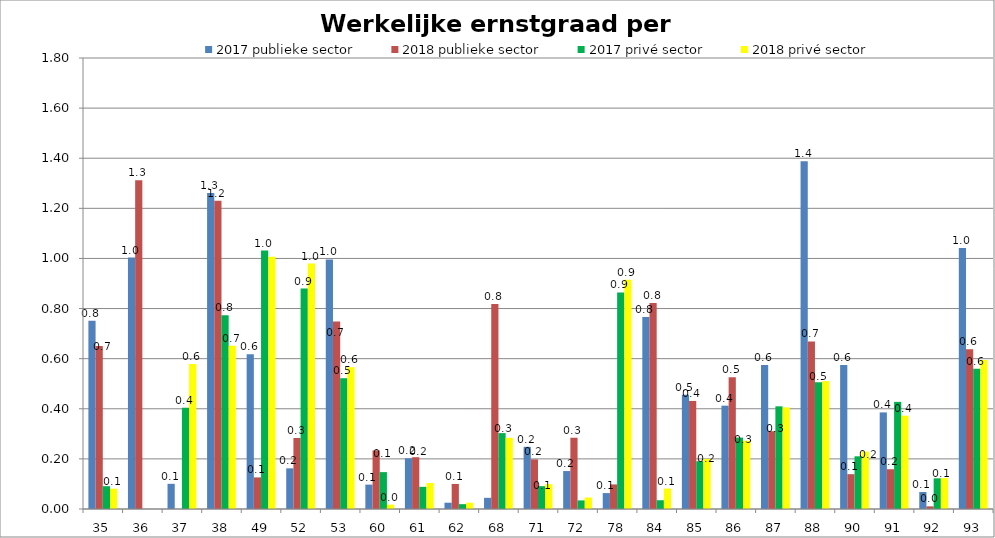
| Category | 2017 publieke sector | 2018 publieke sector | 2017 privé sector | 2018 privé sector |
|---|---|---|---|---|
| 35 | 0.751 | 0.651 | 0.091 | 0.081 |
| 36 | 1.003 | 1.312 | 0 | 0 |
| 37 | 0.1 | 0 | 0.405 | 0.579 |
| 38 | 1.261 | 1.23 | 0.773 | 0.652 |
| 49 | 0.618 | 0.126 | 1.031 | 1.007 |
| 52 | 0.162 | 0.283 | 0.88 | 0.979 |
| 53 | 0.996 | 0.749 | 0.522 | 0.566 |
| 60 | 0.097 | 0.234 | 0.147 | 0.017 |
| 61 | 0.203 | 0.207 | 0.088 | 0.104 |
| 62 | 0.025 | 0.1 | 0.019 | 0.025 |
| 68 | 0.045 | 0.818 | 0.303 | 0.284 |
| 71 | 0.248 | 0.198 | 0.091 | 0.099 |
| 72 | 0.151 | 0.284 | 0.034 | 0.046 |
| 78 | 0.064 | 0.098 | 0.865 | 0.915 |
| 84 | 0.767 | 0.823 | 0.035 | 0.082 |
| 85 | 0.456 | 0.431 | 0.191 | 0.2 |
| 86 | 0.412 | 0.526 | 0.285 | 0.272 |
| 87 | 0.574 | 0.31 | 0.41 | 0.406 |
| 88 | 1.388 | 0.669 | 0.506 | 0.51 |
| 90 | 0.575 | 0.139 | 0.21 | 0.229 |
| 91 | 0.386 | 0.159 | 0.428 | 0.372 |
| 92 | 0.068 | 0.011 | 0.123 | 0.123 |
| 93 | 1.042 | 0.638 | 0.56 | 0.595 |